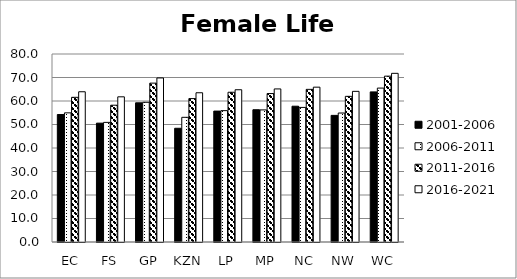
| Category | 2001-2006 | 2006-2011 | 2011-2016 | 2016-2021 |
|---|---|---|---|---|
| EC | 54.245 | 54.954 | 61.568 | 63.932 |
| FS | 50.575 | 50.904 | 58.208 | 61.778 |
| GP | 59.224 | 59.45 | 67.606 | 69.812 |
| KZN | 48.391 | 53.053 | 61.03 | 63.51 |
| LP | 55.706 | 55.9 | 63.721 | 64.788 |
| MP | 56.288 | 56.215 | 63.17 | 65.139 |
| NC | 57.78 | 57.271 | 64.955 | 65.888 |
| NW | 53.879 | 54.887 | 61.986 | 64.102 |
| WC | 63.879 | 65.496 | 70.574 | 71.772 |